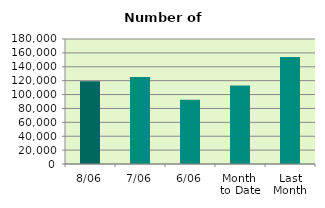
| Category | Series 0 |
|---|---|
| 8/06 | 119318 |
| 7/06 | 125342 |
| 6/06 | 92500 |
| Month 
to Date | 113171.667 |
| Last
Month | 154240.182 |